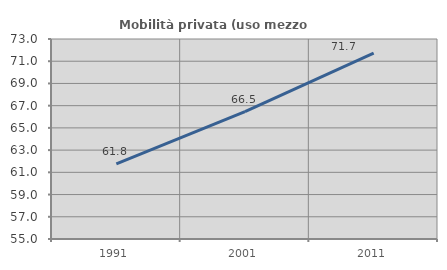
| Category | Mobilità privata (uso mezzo privato) |
|---|---|
| 1991.0 | 61.753 |
| 2001.0 | 66.473 |
| 2011.0 | 71.735 |